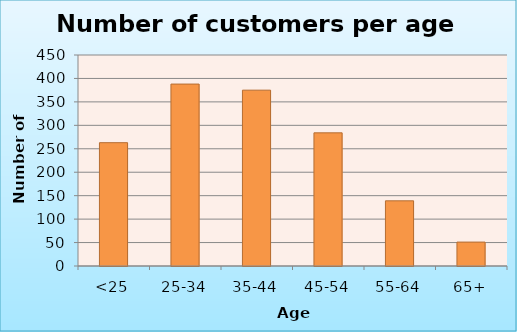
| Category | Total |
|---|---|
| <25 | 263 |
| 25-34 | 388 |
| 35-44 | 375 |
| 45-54 | 284 |
| 55-64 | 139 |
| 65+ | 51 |